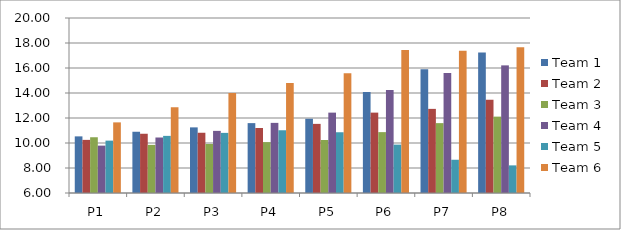
| Category | Team 1 | Team 2 | Team 3 | Team 4 | Team 5 | Team 6 |
|---|---|---|---|---|---|---|
| P1 | 10.53 | 10.25 | 10.46 | 9.79 | 10.19 | 11.65 |
| P2 | 10.9 | 10.74 | 9.85 | 10.44 | 10.57 | 12.87 |
| P3 | 11.25 | 10.82 | 9.92 | 10.97 | 10.81 | 14 |
| P4 | 11.59 | 11.2 | 10.07 | 11.61 | 11.02 | 14.8 |
| P5 | 11.94 | 11.53 | 10.24 | 12.43 | 10.86 | 15.59 |
| P6 | 14.09 | 12.43 | 10.87 | 14.24 | 9.87 | 17.44 |
| P7 | 15.91 | 12.73 | 11.59 | 15.6 | 8.66 | 17.39 |
| P8 | 17.24 | 13.47 | 12.11 | 16.21 | 8.21 | 17.66 |